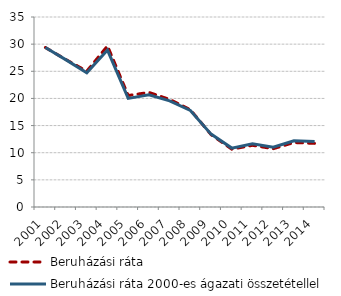
| Category | Beruházási ráta | Beruházási ráta 2000-es ágazati összetétellel |
|---|---|---|
| 2001.0 | 29.378 | 29.378 |
| 2002.0 | 27.144 | 27.096 |
| 2003.0 | 25.015 | 24.73 |
| 2004.0 | 29.668 | 28.914 |
| 2005.0 | 20.534 | 20.007 |
| 2006.0 | 21.106 | 20.68 |
| 2007.0 | 19.814 | 19.557 |
| 2008.0 | 17.916 | 17.791 |
| 2009.0 | 13.327 | 13.426 |
| 2010.0 | 10.656 | 10.847 |
| 2011.0 | 11.363 | 11.639 |
| 2012.0 | 10.741 | 10.999 |
| 2013.0 | 11.879 | 12.189 |
| 2014.0 | 11.717 | 12.079 |